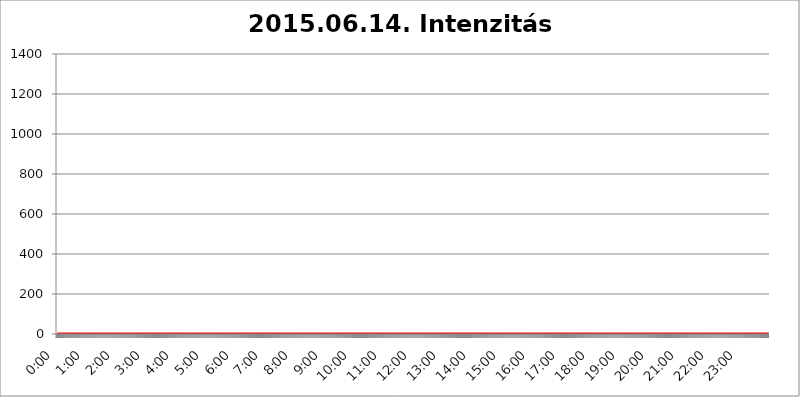
| Category | 2015.06.14. Intenzitás [W/m^2] |
|---|---|
| 0.0 | 0 |
| 0.0006944444444444445 | 0 |
| 0.001388888888888889 | 0 |
| 0.0020833333333333333 | 0 |
| 0.002777777777777778 | 0 |
| 0.003472222222222222 | 0 |
| 0.004166666666666667 | 0 |
| 0.004861111111111111 | 0 |
| 0.005555555555555556 | 0 |
| 0.0062499999999999995 | 0 |
| 0.006944444444444444 | 0 |
| 0.007638888888888889 | 0 |
| 0.008333333333333333 | 0 |
| 0.009027777777777779 | 0 |
| 0.009722222222222222 | 0 |
| 0.010416666666666666 | 0 |
| 0.011111111111111112 | 0 |
| 0.011805555555555555 | 0 |
| 0.012499999999999999 | 0 |
| 0.013194444444444444 | 0 |
| 0.013888888888888888 | 0 |
| 0.014583333333333332 | 0 |
| 0.015277777777777777 | 0 |
| 0.015972222222222224 | 0 |
| 0.016666666666666666 | 0 |
| 0.017361111111111112 | 0 |
| 0.018055555555555557 | 0 |
| 0.01875 | 0 |
| 0.019444444444444445 | 0 |
| 0.02013888888888889 | 0 |
| 0.020833333333333332 | 0 |
| 0.02152777777777778 | 0 |
| 0.022222222222222223 | 0 |
| 0.02291666666666667 | 0 |
| 0.02361111111111111 | 0 |
| 0.024305555555555556 | 0 |
| 0.024999999999999998 | 0 |
| 0.025694444444444447 | 0 |
| 0.02638888888888889 | 0 |
| 0.027083333333333334 | 0 |
| 0.027777777777777776 | 0 |
| 0.02847222222222222 | 0 |
| 0.029166666666666664 | 0 |
| 0.029861111111111113 | 0 |
| 0.030555555555555555 | 0 |
| 0.03125 | 0 |
| 0.03194444444444445 | 0 |
| 0.03263888888888889 | 0 |
| 0.03333333333333333 | 0 |
| 0.034027777777777775 | 0 |
| 0.034722222222222224 | 0 |
| 0.035416666666666666 | 0 |
| 0.036111111111111115 | 0 |
| 0.03680555555555556 | 0 |
| 0.0375 | 0 |
| 0.03819444444444444 | 0 |
| 0.03888888888888889 | 0 |
| 0.03958333333333333 | 0 |
| 0.04027777777777778 | 0 |
| 0.04097222222222222 | 0 |
| 0.041666666666666664 | 0 |
| 0.042361111111111106 | 0 |
| 0.04305555555555556 | 0 |
| 0.043750000000000004 | 0 |
| 0.044444444444444446 | 0 |
| 0.04513888888888889 | 0 |
| 0.04583333333333334 | 0 |
| 0.04652777777777778 | 0 |
| 0.04722222222222222 | 0 |
| 0.04791666666666666 | 0 |
| 0.04861111111111111 | 0 |
| 0.049305555555555554 | 0 |
| 0.049999999999999996 | 0 |
| 0.05069444444444445 | 0 |
| 0.051388888888888894 | 0 |
| 0.052083333333333336 | 0 |
| 0.05277777777777778 | 0 |
| 0.05347222222222222 | 0 |
| 0.05416666666666667 | 0 |
| 0.05486111111111111 | 0 |
| 0.05555555555555555 | 0 |
| 0.05625 | 0 |
| 0.05694444444444444 | 0 |
| 0.057638888888888885 | 0 |
| 0.05833333333333333 | 0 |
| 0.05902777777777778 | 0 |
| 0.059722222222222225 | 0 |
| 0.06041666666666667 | 0 |
| 0.061111111111111116 | 0 |
| 0.06180555555555556 | 0 |
| 0.0625 | 0 |
| 0.06319444444444444 | 0 |
| 0.06388888888888888 | 0 |
| 0.06458333333333334 | 0 |
| 0.06527777777777778 | 0 |
| 0.06597222222222222 | 0 |
| 0.06666666666666667 | 0 |
| 0.06736111111111111 | 0 |
| 0.06805555555555555 | 0 |
| 0.06874999999999999 | 0 |
| 0.06944444444444443 | 0 |
| 0.07013888888888889 | 0 |
| 0.07083333333333333 | 0 |
| 0.07152777777777779 | 0 |
| 0.07222222222222223 | 0 |
| 0.07291666666666667 | 0 |
| 0.07361111111111111 | 0 |
| 0.07430555555555556 | 0 |
| 0.075 | 0 |
| 0.07569444444444444 | 0 |
| 0.0763888888888889 | 0 |
| 0.07708333333333334 | 0 |
| 0.07777777777777778 | 0 |
| 0.07847222222222222 | 0 |
| 0.07916666666666666 | 0 |
| 0.0798611111111111 | 0 |
| 0.08055555555555556 | 0 |
| 0.08125 | 0 |
| 0.08194444444444444 | 0 |
| 0.08263888888888889 | 0 |
| 0.08333333333333333 | 0 |
| 0.08402777777777777 | 0 |
| 0.08472222222222221 | 0 |
| 0.08541666666666665 | 0 |
| 0.08611111111111112 | 0 |
| 0.08680555555555557 | 0 |
| 0.08750000000000001 | 0 |
| 0.08819444444444445 | 0 |
| 0.08888888888888889 | 0 |
| 0.08958333333333333 | 0 |
| 0.09027777777777778 | 0 |
| 0.09097222222222222 | 0 |
| 0.09166666666666667 | 0 |
| 0.09236111111111112 | 0 |
| 0.09305555555555556 | 0 |
| 0.09375 | 0 |
| 0.09444444444444444 | 0 |
| 0.09513888888888888 | 0 |
| 0.09583333333333333 | 0 |
| 0.09652777777777777 | 0 |
| 0.09722222222222222 | 0 |
| 0.09791666666666667 | 0 |
| 0.09861111111111111 | 0 |
| 0.09930555555555555 | 0 |
| 0.09999999999999999 | 0 |
| 0.10069444444444443 | 0 |
| 0.1013888888888889 | 0 |
| 0.10208333333333335 | 0 |
| 0.10277777777777779 | 0 |
| 0.10347222222222223 | 0 |
| 0.10416666666666667 | 0 |
| 0.10486111111111111 | 0 |
| 0.10555555555555556 | 0 |
| 0.10625 | 0 |
| 0.10694444444444444 | 0 |
| 0.1076388888888889 | 0 |
| 0.10833333333333334 | 0 |
| 0.10902777777777778 | 0 |
| 0.10972222222222222 | 0 |
| 0.1111111111111111 | 0 |
| 0.11180555555555556 | 0 |
| 0.11180555555555556 | 0 |
| 0.1125 | 0 |
| 0.11319444444444444 | 0 |
| 0.11388888888888889 | 0 |
| 0.11458333333333333 | 0 |
| 0.11527777777777777 | 0 |
| 0.11597222222222221 | 0 |
| 0.11666666666666665 | 0 |
| 0.1173611111111111 | 0 |
| 0.11805555555555557 | 0 |
| 0.11944444444444445 | 0 |
| 0.12013888888888889 | 0 |
| 0.12083333333333333 | 0 |
| 0.12152777777777778 | 0 |
| 0.12222222222222223 | 0 |
| 0.12291666666666667 | 0 |
| 0.12291666666666667 | 0 |
| 0.12361111111111112 | 0 |
| 0.12430555555555556 | 0 |
| 0.125 | 0 |
| 0.12569444444444444 | 0 |
| 0.12638888888888888 | 0 |
| 0.12708333333333333 | 0 |
| 0.16875 | 0 |
| 0.12847222222222224 | 0 |
| 0.12916666666666668 | 0 |
| 0.12986111111111112 | 0 |
| 0.13055555555555556 | 0 |
| 0.13125 | 0 |
| 0.13194444444444445 | 0 |
| 0.1326388888888889 | 0 |
| 0.13333333333333333 | 0 |
| 0.13402777777777777 | 0 |
| 0.13402777777777777 | 0 |
| 0.13472222222222222 | 0 |
| 0.13541666666666666 | 0 |
| 0.1361111111111111 | 0 |
| 0.13749999999999998 | 0 |
| 0.13819444444444443 | 0 |
| 0.1388888888888889 | 0 |
| 0.13958333333333334 | 0 |
| 0.14027777777777778 | 0 |
| 0.14097222222222222 | 0 |
| 0.14166666666666666 | 0 |
| 0.1423611111111111 | 0 |
| 0.14305555555555557 | 0 |
| 0.14375000000000002 | 0 |
| 0.14444444444444446 | 0 |
| 0.1451388888888889 | 0 |
| 0.1451388888888889 | 0 |
| 0.14652777777777778 | 0 |
| 0.14722222222222223 | 0 |
| 0.14791666666666667 | 0 |
| 0.1486111111111111 | 0 |
| 0.14930555555555555 | 0 |
| 0.15 | 0 |
| 0.15069444444444444 | 0 |
| 0.15138888888888888 | 0 |
| 0.15208333333333332 | 0 |
| 0.15277777777777776 | 0 |
| 0.15347222222222223 | 0 |
| 0.15416666666666667 | 0 |
| 0.15486111111111112 | 0 |
| 0.15555555555555556 | 0 |
| 0.15625 | 0 |
| 0.15694444444444444 | 0 |
| 0.15763888888888888 | 0 |
| 0.15833333333333333 | 0 |
| 0.15902777777777777 | 0 |
| 0.15972222222222224 | 0 |
| 0.16041666666666668 | 0 |
| 0.16111111111111112 | 0 |
| 0.16180555555555556 | 0 |
| 0.1625 | 0 |
| 0.16319444444444445 | 0 |
| 0.1638888888888889 | 0 |
| 0.16458333333333333 | 0 |
| 0.16527777777777777 | 0 |
| 0.16597222222222222 | 0 |
| 0.16666666666666666 | 0 |
| 0.1673611111111111 | 0 |
| 0.16805555555555554 | 0 |
| 0.16874999999999998 | 0 |
| 0.16944444444444443 | 0 |
| 0.17013888888888887 | 0 |
| 0.1708333333333333 | 0 |
| 0.17152777777777775 | 0 |
| 0.17222222222222225 | 0 |
| 0.1729166666666667 | 0 |
| 0.17361111111111113 | 0 |
| 0.17430555555555557 | 0 |
| 0.17500000000000002 | 0 |
| 0.17569444444444446 | 0 |
| 0.1763888888888889 | 0 |
| 0.17708333333333334 | 0 |
| 0.17777777777777778 | 0 |
| 0.17847222222222223 | 0 |
| 0.17916666666666667 | 0 |
| 0.1798611111111111 | 0 |
| 0.18055555555555555 | 0 |
| 0.18125 | 0 |
| 0.18194444444444444 | 0 |
| 0.1826388888888889 | 0 |
| 0.18333333333333335 | 0 |
| 0.1840277777777778 | 0 |
| 0.18472222222222223 | 0 |
| 0.18541666666666667 | 0 |
| 0.18611111111111112 | 0 |
| 0.18680555555555556 | 0 |
| 0.1875 | 0 |
| 0.18819444444444444 | 0 |
| 0.18888888888888888 | 0 |
| 0.18958333333333333 | 0 |
| 0.19027777777777777 | 0 |
| 0.1909722222222222 | 0 |
| 0.19166666666666665 | 0 |
| 0.19236111111111112 | 0 |
| 0.19305555555555554 | 0 |
| 0.19375 | 0 |
| 0.19444444444444445 | 0 |
| 0.1951388888888889 | 0 |
| 0.19583333333333333 | 0 |
| 0.19652777777777777 | 0 |
| 0.19722222222222222 | 0 |
| 0.19791666666666666 | 0 |
| 0.1986111111111111 | 0 |
| 0.19930555555555554 | 0 |
| 0.19999999999999998 | 0 |
| 0.20069444444444443 | 0 |
| 0.20138888888888887 | 0 |
| 0.2020833333333333 | 0 |
| 0.2027777777777778 | 0 |
| 0.2034722222222222 | 0 |
| 0.2041666666666667 | 0 |
| 0.20486111111111113 | 0 |
| 0.20555555555555557 | 0 |
| 0.20625000000000002 | 0 |
| 0.20694444444444446 | 0 |
| 0.2076388888888889 | 0 |
| 0.20833333333333334 | 0 |
| 0.20902777777777778 | 0 |
| 0.20972222222222223 | 0 |
| 0.21041666666666667 | 0 |
| 0.2111111111111111 | 0 |
| 0.21180555555555555 | 0 |
| 0.2125 | 0 |
| 0.21319444444444444 | 0 |
| 0.2138888888888889 | 0 |
| 0.21458333333333335 | 0 |
| 0.2152777777777778 | 0 |
| 0.21597222222222223 | 0 |
| 0.21666666666666667 | 0 |
| 0.21736111111111112 | 0 |
| 0.21805555555555556 | 0 |
| 0.21875 | 0 |
| 0.21944444444444444 | 0 |
| 0.22013888888888888 | 0 |
| 0.22083333333333333 | 0 |
| 0.22152777777777777 | 0 |
| 0.2222222222222222 | 0 |
| 0.22291666666666665 | 0 |
| 0.2236111111111111 | 0 |
| 0.22430555555555556 | 0 |
| 0.225 | 0 |
| 0.22569444444444445 | 0 |
| 0.2263888888888889 | 0 |
| 0.22708333333333333 | 0 |
| 0.22777777777777777 | 0 |
| 0.22847222222222222 | 0 |
| 0.22916666666666666 | 0 |
| 0.2298611111111111 | 0 |
| 0.23055555555555554 | 0 |
| 0.23124999999999998 | 0 |
| 0.23194444444444443 | 0 |
| 0.23263888888888887 | 0 |
| 0.2333333333333333 | 0 |
| 0.2340277777777778 | 0 |
| 0.2347222222222222 | 0 |
| 0.2354166666666667 | 0 |
| 0.23611111111111113 | 0 |
| 0.23680555555555557 | 0 |
| 0.23750000000000002 | 0 |
| 0.23819444444444446 | 0 |
| 0.2388888888888889 | 0 |
| 0.23958333333333334 | 0 |
| 0.24027777777777778 | 0 |
| 0.24097222222222223 | 0 |
| 0.24166666666666667 | 0 |
| 0.2423611111111111 | 0 |
| 0.24305555555555555 | 0 |
| 0.24375 | 0 |
| 0.24444444444444446 | 0 |
| 0.24513888888888888 | 0 |
| 0.24583333333333335 | 0 |
| 0.2465277777777778 | 0 |
| 0.24722222222222223 | 0 |
| 0.24791666666666667 | 0 |
| 0.24861111111111112 | 0 |
| 0.24930555555555556 | 0 |
| 0.25 | 0 |
| 0.25069444444444444 | 0 |
| 0.2513888888888889 | 0 |
| 0.2520833333333333 | 0 |
| 0.25277777777777777 | 0 |
| 0.2534722222222222 | 0 |
| 0.25416666666666665 | 0 |
| 0.2548611111111111 | 0 |
| 0.2555555555555556 | 0 |
| 0.25625000000000003 | 0 |
| 0.2569444444444445 | 0 |
| 0.2576388888888889 | 0 |
| 0.25833333333333336 | 0 |
| 0.2590277777777778 | 0 |
| 0.25972222222222224 | 0 |
| 0.2604166666666667 | 0 |
| 0.2611111111111111 | 0 |
| 0.26180555555555557 | 0 |
| 0.2625 | 0 |
| 0.26319444444444445 | 0 |
| 0.2638888888888889 | 0 |
| 0.26458333333333334 | 0 |
| 0.2652777777777778 | 0 |
| 0.2659722222222222 | 0 |
| 0.26666666666666666 | 0 |
| 0.2673611111111111 | 0 |
| 0.26805555555555555 | 0 |
| 0.26875 | 0 |
| 0.26944444444444443 | 0 |
| 0.2701388888888889 | 0 |
| 0.2708333333333333 | 0 |
| 0.27152777777777776 | 0 |
| 0.2722222222222222 | 0 |
| 0.27291666666666664 | 0 |
| 0.2736111111111111 | 0 |
| 0.2743055555555555 | 0 |
| 0.27499999999999997 | 0 |
| 0.27569444444444446 | 0 |
| 0.27638888888888885 | 0 |
| 0.27708333333333335 | 0 |
| 0.2777777777777778 | 0 |
| 0.27847222222222223 | 0 |
| 0.2791666666666667 | 0 |
| 0.2798611111111111 | 0 |
| 0.28055555555555556 | 0 |
| 0.28125 | 0 |
| 0.28194444444444444 | 0 |
| 0.2826388888888889 | 0 |
| 0.2833333333333333 | 0 |
| 0.28402777777777777 | 0 |
| 0.2847222222222222 | 0 |
| 0.28541666666666665 | 0 |
| 0.28611111111111115 | 0 |
| 0.28680555555555554 | 0 |
| 0.28750000000000003 | 0 |
| 0.2881944444444445 | 0 |
| 0.2888888888888889 | 0 |
| 0.28958333333333336 | 0 |
| 0.2902777777777778 | 0 |
| 0.29097222222222224 | 0 |
| 0.2916666666666667 | 0 |
| 0.2923611111111111 | 0 |
| 0.29305555555555557 | 0 |
| 0.29375 | 0 |
| 0.29444444444444445 | 0 |
| 0.2951388888888889 | 0 |
| 0.29583333333333334 | 0 |
| 0.2965277777777778 | 0 |
| 0.2972222222222222 | 0 |
| 0.29791666666666666 | 0 |
| 0.2986111111111111 | 0 |
| 0.29930555555555555 | 0 |
| 0.3 | 0 |
| 0.30069444444444443 | 0 |
| 0.3013888888888889 | 0 |
| 0.3020833333333333 | 0 |
| 0.30277777777777776 | 0 |
| 0.3034722222222222 | 0 |
| 0.30416666666666664 | 0 |
| 0.3048611111111111 | 0 |
| 0.3055555555555555 | 0 |
| 0.30624999999999997 | 0 |
| 0.3069444444444444 | 0 |
| 0.3076388888888889 | 0 |
| 0.30833333333333335 | 0 |
| 0.3090277777777778 | 0 |
| 0.30972222222222223 | 0 |
| 0.3104166666666667 | 0 |
| 0.3111111111111111 | 0 |
| 0.31180555555555556 | 0 |
| 0.3125 | 0 |
| 0.31319444444444444 | 0 |
| 0.3138888888888889 | 0 |
| 0.3145833333333333 | 0 |
| 0.31527777777777777 | 0 |
| 0.3159722222222222 | 0 |
| 0.31666666666666665 | 0 |
| 0.31736111111111115 | 0 |
| 0.31805555555555554 | 0 |
| 0.31875000000000003 | 0 |
| 0.3194444444444445 | 0 |
| 0.3201388888888889 | 0 |
| 0.32083333333333336 | 0 |
| 0.3215277777777778 | 0 |
| 0.32222222222222224 | 0 |
| 0.3229166666666667 | 0 |
| 0.3236111111111111 | 0 |
| 0.32430555555555557 | 0 |
| 0.325 | 0 |
| 0.32569444444444445 | 0 |
| 0.3263888888888889 | 0 |
| 0.32708333333333334 | 0 |
| 0.3277777777777778 | 0 |
| 0.3284722222222222 | 0 |
| 0.32916666666666666 | 0 |
| 0.3298611111111111 | 0 |
| 0.33055555555555555 | 0 |
| 0.33125 | 0 |
| 0.33194444444444443 | 0 |
| 0.3326388888888889 | 0 |
| 0.3333333333333333 | 0 |
| 0.3340277777777778 | 0 |
| 0.3347222222222222 | 0 |
| 0.3354166666666667 | 0 |
| 0.3361111111111111 | 0 |
| 0.3368055555555556 | 0 |
| 0.33749999999999997 | 0 |
| 0.33819444444444446 | 0 |
| 0.33888888888888885 | 0 |
| 0.33958333333333335 | 0 |
| 0.34027777777777773 | 0 |
| 0.34097222222222223 | 0 |
| 0.3416666666666666 | 0 |
| 0.3423611111111111 | 0 |
| 0.3430555555555555 | 0 |
| 0.34375 | 0 |
| 0.3444444444444445 | 0 |
| 0.3451388888888889 | 0 |
| 0.3458333333333334 | 0 |
| 0.34652777777777777 | 0 |
| 0.34722222222222227 | 0 |
| 0.34791666666666665 | 0 |
| 0.34861111111111115 | 0 |
| 0.34930555555555554 | 0 |
| 0.35000000000000003 | 0 |
| 0.3506944444444444 | 0 |
| 0.3513888888888889 | 0 |
| 0.3520833333333333 | 0 |
| 0.3527777777777778 | 0 |
| 0.3534722222222222 | 0 |
| 0.3541666666666667 | 0 |
| 0.3548611111111111 | 0 |
| 0.35555555555555557 | 0 |
| 0.35625 | 0 |
| 0.35694444444444445 | 0 |
| 0.3576388888888889 | 0 |
| 0.35833333333333334 | 0 |
| 0.3590277777777778 | 0 |
| 0.3597222222222222 | 0 |
| 0.36041666666666666 | 0 |
| 0.3611111111111111 | 0 |
| 0.36180555555555555 | 0 |
| 0.3625 | 0 |
| 0.36319444444444443 | 0 |
| 0.3638888888888889 | 0 |
| 0.3645833333333333 | 0 |
| 0.3652777777777778 | 0 |
| 0.3659722222222222 | 0 |
| 0.3666666666666667 | 0 |
| 0.3673611111111111 | 0 |
| 0.3680555555555556 | 0 |
| 0.36874999999999997 | 0 |
| 0.36944444444444446 | 0 |
| 0.37013888888888885 | 0 |
| 0.37083333333333335 | 0 |
| 0.37152777777777773 | 0 |
| 0.37222222222222223 | 0 |
| 0.3729166666666666 | 0 |
| 0.3736111111111111 | 0 |
| 0.3743055555555555 | 0 |
| 0.375 | 0 |
| 0.3756944444444445 | 0 |
| 0.3763888888888889 | 0 |
| 0.3770833333333334 | 0 |
| 0.37777777777777777 | 0 |
| 0.37847222222222227 | 0 |
| 0.37916666666666665 | 0 |
| 0.37986111111111115 | 0 |
| 0.38055555555555554 | 0 |
| 0.38125000000000003 | 0 |
| 0.3819444444444444 | 0 |
| 0.3826388888888889 | 0 |
| 0.3833333333333333 | 0 |
| 0.3840277777777778 | 0 |
| 0.3847222222222222 | 0 |
| 0.3854166666666667 | 0 |
| 0.3861111111111111 | 0 |
| 0.38680555555555557 | 0 |
| 0.3875 | 0 |
| 0.38819444444444445 | 0 |
| 0.3888888888888889 | 0 |
| 0.38958333333333334 | 0 |
| 0.3902777777777778 | 0 |
| 0.3909722222222222 | 0 |
| 0.39166666666666666 | 0 |
| 0.3923611111111111 | 0 |
| 0.39305555555555555 | 0 |
| 0.39375 | 0 |
| 0.39444444444444443 | 0 |
| 0.3951388888888889 | 0 |
| 0.3958333333333333 | 0 |
| 0.3965277777777778 | 0 |
| 0.3972222222222222 | 0 |
| 0.3979166666666667 | 0 |
| 0.3986111111111111 | 0 |
| 0.3993055555555556 | 0 |
| 0.39999999999999997 | 0 |
| 0.40069444444444446 | 0 |
| 0.40138888888888885 | 0 |
| 0.40208333333333335 | 0 |
| 0.40277777777777773 | 0 |
| 0.40347222222222223 | 0 |
| 0.4041666666666666 | 0 |
| 0.4048611111111111 | 0 |
| 0.4055555555555555 | 0 |
| 0.40625 | 0 |
| 0.4069444444444445 | 0 |
| 0.4076388888888889 | 0 |
| 0.4083333333333334 | 0 |
| 0.40902777777777777 | 0 |
| 0.40972222222222227 | 0 |
| 0.41041666666666665 | 0 |
| 0.41111111111111115 | 0 |
| 0.41180555555555554 | 0 |
| 0.41250000000000003 | 0 |
| 0.4131944444444444 | 0 |
| 0.4138888888888889 | 0 |
| 0.4145833333333333 | 0 |
| 0.4152777777777778 | 0 |
| 0.4159722222222222 | 0 |
| 0.4166666666666667 | 0 |
| 0.4173611111111111 | 0 |
| 0.41805555555555557 | 0 |
| 0.41875 | 0 |
| 0.41944444444444445 | 0 |
| 0.4201388888888889 | 0 |
| 0.42083333333333334 | 0 |
| 0.4215277777777778 | 0 |
| 0.4222222222222222 | 0 |
| 0.42291666666666666 | 0 |
| 0.4236111111111111 | 0 |
| 0.42430555555555555 | 0 |
| 0.425 | 0 |
| 0.42569444444444443 | 0 |
| 0.4263888888888889 | 0 |
| 0.4270833333333333 | 0 |
| 0.4277777777777778 | 0 |
| 0.4284722222222222 | 0 |
| 0.4291666666666667 | 0 |
| 0.4298611111111111 | 0 |
| 0.4305555555555556 | 0 |
| 0.43124999999999997 | 0 |
| 0.43194444444444446 | 0 |
| 0.43263888888888885 | 0 |
| 0.43333333333333335 | 0 |
| 0.43402777777777773 | 0 |
| 0.43472222222222223 | 0 |
| 0.4354166666666666 | 0 |
| 0.4361111111111111 | 0 |
| 0.4368055555555555 | 0 |
| 0.4375 | 0 |
| 0.4381944444444445 | 0 |
| 0.4388888888888889 | 0 |
| 0.4395833333333334 | 0 |
| 0.44027777777777777 | 0 |
| 0.44097222222222227 | 0 |
| 0.44166666666666665 | 0 |
| 0.44236111111111115 | 0 |
| 0.44305555555555554 | 0 |
| 0.44375000000000003 | 0 |
| 0.4444444444444444 | 0 |
| 0.4451388888888889 | 0 |
| 0.4458333333333333 | 0 |
| 0.4465277777777778 | 0 |
| 0.4472222222222222 | 0 |
| 0.4479166666666667 | 0 |
| 0.4486111111111111 | 0 |
| 0.44930555555555557 | 0 |
| 0.45 | 0 |
| 0.45069444444444445 | 0 |
| 0.4513888888888889 | 0 |
| 0.45208333333333334 | 0 |
| 0.4527777777777778 | 0 |
| 0.4534722222222222 | 0 |
| 0.45416666666666666 | 0 |
| 0.4548611111111111 | 0 |
| 0.45555555555555555 | 0 |
| 0.45625 | 0 |
| 0.45694444444444443 | 0 |
| 0.4576388888888889 | 0 |
| 0.4583333333333333 | 0 |
| 0.4590277777777778 | 0 |
| 0.4597222222222222 | 0 |
| 0.4604166666666667 | 0 |
| 0.4611111111111111 | 0 |
| 0.4618055555555556 | 0 |
| 0.46249999999999997 | 0 |
| 0.46319444444444446 | 0 |
| 0.46388888888888885 | 0 |
| 0.46458333333333335 | 0 |
| 0.46527777777777773 | 0 |
| 0.46597222222222223 | 0 |
| 0.4666666666666666 | 0 |
| 0.4673611111111111 | 0 |
| 0.4680555555555555 | 0 |
| 0.46875 | 0 |
| 0.4694444444444445 | 0 |
| 0.4701388888888889 | 0 |
| 0.4708333333333334 | 0 |
| 0.47152777777777777 | 0 |
| 0.47222222222222227 | 0 |
| 0.47291666666666665 | 0 |
| 0.47361111111111115 | 0 |
| 0.47430555555555554 | 0 |
| 0.47500000000000003 | 0 |
| 0.4756944444444444 | 0 |
| 0.4763888888888889 | 0 |
| 0.4770833333333333 | 0 |
| 0.4777777777777778 | 0 |
| 0.4784722222222222 | 0 |
| 0.4791666666666667 | 0 |
| 0.4798611111111111 | 0 |
| 0.48055555555555557 | 0 |
| 0.48125 | 0 |
| 0.48194444444444445 | 0 |
| 0.4826388888888889 | 0 |
| 0.48333333333333334 | 0 |
| 0.4840277777777778 | 0 |
| 0.4847222222222222 | 0 |
| 0.48541666666666666 | 0 |
| 0.4861111111111111 | 0 |
| 0.48680555555555555 | 0 |
| 0.4875 | 0 |
| 0.48819444444444443 | 0 |
| 0.4888888888888889 | 0 |
| 0.4895833333333333 | 0 |
| 0.4902777777777778 | 0 |
| 0.4909722222222222 | 0 |
| 0.4916666666666667 | 0 |
| 0.4923611111111111 | 0 |
| 0.4930555555555556 | 0 |
| 0.49374999999999997 | 0 |
| 0.49444444444444446 | 0 |
| 0.49513888888888885 | 0 |
| 0.49583333333333335 | 0 |
| 0.49652777777777773 | 0 |
| 0.49722222222222223 | 0 |
| 0.4979166666666666 | 0 |
| 0.4986111111111111 | 0 |
| 0.4993055555555555 | 0 |
| 0.5 | 0 |
| 0.5006944444444444 | 0 |
| 0.5013888888888889 | 0 |
| 0.5020833333333333 | 0 |
| 0.5027777777777778 | 0 |
| 0.5034722222222222 | 0 |
| 0.5041666666666667 | 0 |
| 0.5048611111111111 | 0 |
| 0.5055555555555555 | 0 |
| 0.50625 | 0 |
| 0.5069444444444444 | 0 |
| 0.5076388888888889 | 0 |
| 0.5083333333333333 | 0 |
| 0.5090277777777777 | 0 |
| 0.5097222222222222 | 0 |
| 0.5104166666666666 | 0 |
| 0.5111111111111112 | 0 |
| 0.5118055555555555 | 0 |
| 0.5125000000000001 | 0 |
| 0.5131944444444444 | 0 |
| 0.513888888888889 | 0 |
| 0.5145833333333333 | 0 |
| 0.5152777777777778 | 0 |
| 0.5159722222222222 | 0 |
| 0.5166666666666667 | 0 |
| 0.517361111111111 | 0 |
| 0.5180555555555556 | 0 |
| 0.5187499999999999 | 0 |
| 0.5194444444444445 | 0 |
| 0.5201388888888888 | 0 |
| 0.5208333333333334 | 0 |
| 0.5215277777777778 | 0 |
| 0.5222222222222223 | 0 |
| 0.5229166666666667 | 0 |
| 0.5236111111111111 | 0 |
| 0.5243055555555556 | 0 |
| 0.525 | 0 |
| 0.5256944444444445 | 0 |
| 0.5263888888888889 | 0 |
| 0.5270833333333333 | 0 |
| 0.5277777777777778 | 0 |
| 0.5284722222222222 | 0 |
| 0.5291666666666667 | 0 |
| 0.5298611111111111 | 0 |
| 0.5305555555555556 | 0 |
| 0.53125 | 0 |
| 0.5319444444444444 | 0 |
| 0.5326388888888889 | 0 |
| 0.5333333333333333 | 0 |
| 0.5340277777777778 | 0 |
| 0.5347222222222222 | 0 |
| 0.5354166666666667 | 0 |
| 0.5361111111111111 | 0 |
| 0.5368055555555555 | 0 |
| 0.5375 | 0 |
| 0.5381944444444444 | 0 |
| 0.5388888888888889 | 0 |
| 0.5395833333333333 | 0 |
| 0.5402777777777777 | 0 |
| 0.5409722222222222 | 0 |
| 0.5416666666666666 | 0 |
| 0.5423611111111112 | 0 |
| 0.5430555555555555 | 0 |
| 0.5437500000000001 | 0 |
| 0.5444444444444444 | 0 |
| 0.545138888888889 | 0 |
| 0.5458333333333333 | 0 |
| 0.5465277777777778 | 0 |
| 0.5472222222222222 | 0 |
| 0.5479166666666667 | 0 |
| 0.548611111111111 | 0 |
| 0.5493055555555556 | 0 |
| 0.5499999999999999 | 0 |
| 0.5506944444444445 | 0 |
| 0.5513888888888888 | 0 |
| 0.5520833333333334 | 0 |
| 0.5527777777777778 | 0 |
| 0.5534722222222223 | 0 |
| 0.5541666666666667 | 0 |
| 0.5548611111111111 | 0 |
| 0.5555555555555556 | 0 |
| 0.55625 | 0 |
| 0.5569444444444445 | 0 |
| 0.5576388888888889 | 0 |
| 0.5583333333333333 | 0 |
| 0.5590277777777778 | 0 |
| 0.5597222222222222 | 0 |
| 0.5604166666666667 | 0 |
| 0.5611111111111111 | 0 |
| 0.5618055555555556 | 0 |
| 0.5625 | 0 |
| 0.5631944444444444 | 0 |
| 0.5638888888888889 | 0 |
| 0.5645833333333333 | 0 |
| 0.5652777777777778 | 0 |
| 0.5659722222222222 | 0 |
| 0.5666666666666667 | 0 |
| 0.5673611111111111 | 0 |
| 0.5680555555555555 | 0 |
| 0.56875 | 0 |
| 0.5694444444444444 | 0 |
| 0.5701388888888889 | 0 |
| 0.5708333333333333 | 0 |
| 0.5715277777777777 | 0 |
| 0.5722222222222222 | 0 |
| 0.5729166666666666 | 0 |
| 0.5736111111111112 | 0 |
| 0.5743055555555555 | 0 |
| 0.5750000000000001 | 0 |
| 0.5756944444444444 | 0 |
| 0.576388888888889 | 0 |
| 0.5770833333333333 | 0 |
| 0.5777777777777778 | 0 |
| 0.5784722222222222 | 0 |
| 0.5791666666666667 | 0 |
| 0.579861111111111 | 0 |
| 0.5805555555555556 | 0 |
| 0.5812499999999999 | 0 |
| 0.5819444444444445 | 0 |
| 0.5826388888888888 | 0 |
| 0.5833333333333334 | 0 |
| 0.5840277777777778 | 0 |
| 0.5847222222222223 | 0 |
| 0.5854166666666667 | 0 |
| 0.5861111111111111 | 0 |
| 0.5868055555555556 | 0 |
| 0.5875 | 0 |
| 0.5881944444444445 | 0 |
| 0.5888888888888889 | 0 |
| 0.5895833333333333 | 0 |
| 0.5902777777777778 | 0 |
| 0.5909722222222222 | 0 |
| 0.5916666666666667 | 0 |
| 0.5923611111111111 | 0 |
| 0.5930555555555556 | 0 |
| 0.59375 | 0 |
| 0.5944444444444444 | 0 |
| 0.5951388888888889 | 0 |
| 0.5958333333333333 | 0 |
| 0.5965277777777778 | 0 |
| 0.5972222222222222 | 0 |
| 0.5979166666666667 | 0 |
| 0.5986111111111111 | 0 |
| 0.5993055555555555 | 0 |
| 0.6 | 0 |
| 0.6006944444444444 | 0 |
| 0.6013888888888889 | 0 |
| 0.6020833333333333 | 0 |
| 0.6027777777777777 | 0 |
| 0.6034722222222222 | 0 |
| 0.6041666666666666 | 0 |
| 0.6048611111111112 | 0 |
| 0.6055555555555555 | 0 |
| 0.6062500000000001 | 0 |
| 0.6069444444444444 | 0 |
| 0.607638888888889 | 0 |
| 0.6083333333333333 | 0 |
| 0.6090277777777778 | 0 |
| 0.6097222222222222 | 0 |
| 0.6104166666666667 | 0 |
| 0.611111111111111 | 0 |
| 0.6118055555555556 | 0 |
| 0.6124999999999999 | 0 |
| 0.6131944444444445 | 0 |
| 0.6138888888888888 | 0 |
| 0.6145833333333334 | 0 |
| 0.6152777777777778 | 0 |
| 0.6159722222222223 | 0 |
| 0.6166666666666667 | 0 |
| 0.6173611111111111 | 0 |
| 0.6180555555555556 | 0 |
| 0.61875 | 0 |
| 0.6194444444444445 | 0 |
| 0.6201388888888889 | 0 |
| 0.6208333333333333 | 0 |
| 0.6215277777777778 | 0 |
| 0.6222222222222222 | 0 |
| 0.6229166666666667 | 0 |
| 0.6236111111111111 | 0 |
| 0.6243055555555556 | 0 |
| 0.625 | 0 |
| 0.6256944444444444 | 0 |
| 0.6263888888888889 | 0 |
| 0.6270833333333333 | 0 |
| 0.6277777777777778 | 0 |
| 0.6284722222222222 | 0 |
| 0.6291666666666667 | 0 |
| 0.6298611111111111 | 0 |
| 0.6305555555555555 | 0 |
| 0.63125 | 0 |
| 0.6319444444444444 | 0 |
| 0.6326388888888889 | 0 |
| 0.6333333333333333 | 0 |
| 0.6340277777777777 | 0 |
| 0.6347222222222222 | 0 |
| 0.6354166666666666 | 0 |
| 0.6361111111111112 | 0 |
| 0.6368055555555555 | 0 |
| 0.6375000000000001 | 0 |
| 0.6381944444444444 | 0 |
| 0.638888888888889 | 0 |
| 0.6395833333333333 | 0 |
| 0.6402777777777778 | 0 |
| 0.6409722222222222 | 0 |
| 0.6416666666666667 | 0 |
| 0.642361111111111 | 0 |
| 0.6430555555555556 | 0 |
| 0.6437499999999999 | 0 |
| 0.6444444444444445 | 0 |
| 0.6451388888888888 | 0 |
| 0.6458333333333334 | 0 |
| 0.6465277777777778 | 0 |
| 0.6472222222222223 | 0 |
| 0.6479166666666667 | 0 |
| 0.6486111111111111 | 0 |
| 0.6493055555555556 | 0 |
| 0.65 | 0 |
| 0.6506944444444445 | 0 |
| 0.6513888888888889 | 0 |
| 0.6520833333333333 | 0 |
| 0.6527777777777778 | 0 |
| 0.6534722222222222 | 0 |
| 0.6541666666666667 | 0 |
| 0.6548611111111111 | 0 |
| 0.6555555555555556 | 0 |
| 0.65625 | 0 |
| 0.6569444444444444 | 0 |
| 0.6576388888888889 | 0 |
| 0.6583333333333333 | 0 |
| 0.6590277777777778 | 0 |
| 0.6597222222222222 | 0 |
| 0.6604166666666667 | 0 |
| 0.6611111111111111 | 0 |
| 0.6618055555555555 | 0 |
| 0.6625 | 0 |
| 0.6631944444444444 | 0 |
| 0.6638888888888889 | 0 |
| 0.6645833333333333 | 0 |
| 0.6652777777777777 | 0 |
| 0.6659722222222222 | 0 |
| 0.6666666666666666 | 0 |
| 0.6673611111111111 | 0 |
| 0.6680555555555556 | 0 |
| 0.6687500000000001 | 0 |
| 0.6694444444444444 | 0 |
| 0.6701388888888888 | 0 |
| 0.6708333333333334 | 0 |
| 0.6715277777777778 | 0 |
| 0.6722222222222222 | 0 |
| 0.6729166666666666 | 0 |
| 0.6736111111111112 | 0 |
| 0.6743055555555556 | 0 |
| 0.6749999999999999 | 0 |
| 0.6756944444444444 | 0 |
| 0.6763888888888889 | 0 |
| 0.6770833333333334 | 0 |
| 0.6777777777777777 | 0 |
| 0.6784722222222223 | 0 |
| 0.6791666666666667 | 0 |
| 0.6798611111111111 | 0 |
| 0.6805555555555555 | 0 |
| 0.68125 | 0 |
| 0.6819444444444445 | 0 |
| 0.6826388888888889 | 0 |
| 0.6833333333333332 | 0 |
| 0.6840277777777778 | 0 |
| 0.6847222222222222 | 0 |
| 0.6854166666666667 | 0 |
| 0.686111111111111 | 0 |
| 0.6868055555555556 | 0 |
| 0.6875 | 0 |
| 0.6881944444444444 | 0 |
| 0.688888888888889 | 0 |
| 0.6895833333333333 | 0 |
| 0.6902777777777778 | 0 |
| 0.6909722222222222 | 0 |
| 0.6916666666666668 | 0 |
| 0.6923611111111111 | 0 |
| 0.6930555555555555 | 0 |
| 0.69375 | 0 |
| 0.6944444444444445 | 0 |
| 0.6951388888888889 | 0 |
| 0.6958333333333333 | 0 |
| 0.6965277777777777 | 0 |
| 0.6972222222222223 | 0 |
| 0.6979166666666666 | 0 |
| 0.6986111111111111 | 0 |
| 0.6993055555555556 | 0 |
| 0.7000000000000001 | 0 |
| 0.7006944444444444 | 0 |
| 0.7013888888888888 | 0 |
| 0.7020833333333334 | 0 |
| 0.7027777777777778 | 0 |
| 0.7034722222222222 | 0 |
| 0.7041666666666666 | 0 |
| 0.7048611111111112 | 0 |
| 0.7055555555555556 | 0 |
| 0.7062499999999999 | 0 |
| 0.7069444444444444 | 0 |
| 0.7076388888888889 | 0 |
| 0.7083333333333334 | 0 |
| 0.7090277777777777 | 0 |
| 0.7097222222222223 | 0 |
| 0.7104166666666667 | 0 |
| 0.7111111111111111 | 0 |
| 0.7118055555555555 | 0 |
| 0.7125 | 0 |
| 0.7131944444444445 | 0 |
| 0.7138888888888889 | 0 |
| 0.7145833333333332 | 0 |
| 0.7152777777777778 | 0 |
| 0.7159722222222222 | 0 |
| 0.7166666666666667 | 0 |
| 0.717361111111111 | 0 |
| 0.7180555555555556 | 0 |
| 0.71875 | 0 |
| 0.7194444444444444 | 0 |
| 0.720138888888889 | 0 |
| 0.7208333333333333 | 0 |
| 0.7215277777777778 | 0 |
| 0.7222222222222222 | 0 |
| 0.7229166666666668 | 0 |
| 0.7236111111111111 | 0 |
| 0.7243055555555555 | 0 |
| 0.725 | 0 |
| 0.7256944444444445 | 0 |
| 0.7263888888888889 | 0 |
| 0.7270833333333333 | 0 |
| 0.7277777777777777 | 0 |
| 0.7284722222222223 | 0 |
| 0.7291666666666666 | 0 |
| 0.7298611111111111 | 0 |
| 0.7305555555555556 | 0 |
| 0.7312500000000001 | 0 |
| 0.7319444444444444 | 0 |
| 0.7326388888888888 | 0 |
| 0.7333333333333334 | 0 |
| 0.7340277777777778 | 0 |
| 0.7347222222222222 | 0 |
| 0.7354166666666666 | 0 |
| 0.7361111111111112 | 0 |
| 0.7368055555555556 | 0 |
| 0.7374999999999999 | 0 |
| 0.7381944444444444 | 0 |
| 0.7388888888888889 | 0 |
| 0.7395833333333334 | 0 |
| 0.7402777777777777 | 0 |
| 0.7409722222222223 | 0 |
| 0.7416666666666667 | 0 |
| 0.7423611111111111 | 0 |
| 0.7430555555555555 | 0 |
| 0.74375 | 0 |
| 0.7444444444444445 | 0 |
| 0.7451388888888889 | 0 |
| 0.7458333333333332 | 0 |
| 0.7465277777777778 | 0 |
| 0.7472222222222222 | 0 |
| 0.7479166666666667 | 0 |
| 0.748611111111111 | 0 |
| 0.7493055555555556 | 0 |
| 0.75 | 0 |
| 0.7506944444444444 | 0 |
| 0.751388888888889 | 0 |
| 0.7520833333333333 | 0 |
| 0.7527777777777778 | 0 |
| 0.7534722222222222 | 0 |
| 0.7541666666666668 | 0 |
| 0.7548611111111111 | 0 |
| 0.7555555555555555 | 0 |
| 0.75625 | 0 |
| 0.7569444444444445 | 0 |
| 0.7576388888888889 | 0 |
| 0.7583333333333333 | 0 |
| 0.7590277777777777 | 0 |
| 0.7597222222222223 | 0 |
| 0.7604166666666666 | 0 |
| 0.7611111111111111 | 0 |
| 0.7618055555555556 | 0 |
| 0.7625000000000001 | 0 |
| 0.7631944444444444 | 0 |
| 0.7638888888888888 | 0 |
| 0.7645833333333334 | 0 |
| 0.7652777777777778 | 0 |
| 0.7659722222222222 | 0 |
| 0.7666666666666666 | 0 |
| 0.7673611111111112 | 0 |
| 0.7680555555555556 | 0 |
| 0.7687499999999999 | 0 |
| 0.7694444444444444 | 0 |
| 0.7701388888888889 | 0 |
| 0.7708333333333334 | 0 |
| 0.7715277777777777 | 0 |
| 0.7722222222222223 | 0 |
| 0.7729166666666667 | 0 |
| 0.7736111111111111 | 0 |
| 0.7743055555555555 | 0 |
| 0.775 | 0 |
| 0.7756944444444445 | 0 |
| 0.7763888888888889 | 0 |
| 0.7770833333333332 | 0 |
| 0.7777777777777778 | 0 |
| 0.7784722222222222 | 0 |
| 0.7791666666666667 | 0 |
| 0.779861111111111 | 0 |
| 0.7805555555555556 | 0 |
| 0.78125 | 0 |
| 0.7819444444444444 | 0 |
| 0.782638888888889 | 0 |
| 0.7833333333333333 | 0 |
| 0.7840277777777778 | 0 |
| 0.7847222222222222 | 0 |
| 0.7854166666666668 | 0 |
| 0.7861111111111111 | 0 |
| 0.7868055555555555 | 0 |
| 0.7875 | 0 |
| 0.7881944444444445 | 0 |
| 0.7888888888888889 | 0 |
| 0.7895833333333333 | 0 |
| 0.7902777777777777 | 0 |
| 0.7909722222222223 | 0 |
| 0.7916666666666666 | 0 |
| 0.7923611111111111 | 0 |
| 0.7930555555555556 | 0 |
| 0.7937500000000001 | 0 |
| 0.7944444444444444 | 0 |
| 0.7951388888888888 | 0 |
| 0.7958333333333334 | 0 |
| 0.7965277777777778 | 0 |
| 0.7972222222222222 | 0 |
| 0.7979166666666666 | 0 |
| 0.7986111111111112 | 0 |
| 0.7993055555555556 | 0 |
| 0.7999999999999999 | 0 |
| 0.8006944444444444 | 0 |
| 0.8013888888888889 | 0 |
| 0.8020833333333334 | 0 |
| 0.8027777777777777 | 0 |
| 0.8034722222222223 | 0 |
| 0.8041666666666667 | 0 |
| 0.8048611111111111 | 0 |
| 0.8055555555555555 | 0 |
| 0.80625 | 0 |
| 0.8069444444444445 | 0 |
| 0.8076388888888889 | 0 |
| 0.8083333333333332 | 0 |
| 0.8090277777777778 | 0 |
| 0.8097222222222222 | 0 |
| 0.8104166666666667 | 0 |
| 0.811111111111111 | 0 |
| 0.8118055555555556 | 0 |
| 0.8125 | 0 |
| 0.8131944444444444 | 0 |
| 0.813888888888889 | 0 |
| 0.8145833333333333 | 0 |
| 0.8152777777777778 | 0 |
| 0.8159722222222222 | 0 |
| 0.8166666666666668 | 0 |
| 0.8173611111111111 | 0 |
| 0.8180555555555555 | 0 |
| 0.81875 | 0 |
| 0.8194444444444445 | 0 |
| 0.8201388888888889 | 0 |
| 0.8208333333333333 | 0 |
| 0.8215277777777777 | 0 |
| 0.8222222222222223 | 0 |
| 0.8229166666666666 | 0 |
| 0.8236111111111111 | 0 |
| 0.8243055555555556 | 0 |
| 0.8250000000000001 | 0 |
| 0.8256944444444444 | 0 |
| 0.8263888888888888 | 0 |
| 0.8270833333333334 | 0 |
| 0.8277777777777778 | 0 |
| 0.8284722222222222 | 0 |
| 0.8291666666666666 | 0 |
| 0.8298611111111112 | 0 |
| 0.8305555555555556 | 0 |
| 0.8312499999999999 | 0 |
| 0.8319444444444444 | 0 |
| 0.8326388888888889 | 0 |
| 0.8333333333333334 | 0 |
| 0.8340277777777777 | 0 |
| 0.8347222222222223 | 0 |
| 0.8354166666666667 | 0 |
| 0.8361111111111111 | 0 |
| 0.8368055555555555 | 0 |
| 0.8375 | 0 |
| 0.8381944444444445 | 0 |
| 0.8388888888888889 | 0 |
| 0.8395833333333332 | 0 |
| 0.8402777777777778 | 0 |
| 0.8409722222222222 | 0 |
| 0.8416666666666667 | 0 |
| 0.842361111111111 | 0 |
| 0.8430555555555556 | 0 |
| 0.84375 | 0 |
| 0.8444444444444444 | 0 |
| 0.845138888888889 | 0 |
| 0.8458333333333333 | 0 |
| 0.8465277777777778 | 0 |
| 0.8472222222222222 | 0 |
| 0.8479166666666668 | 0 |
| 0.8486111111111111 | 0 |
| 0.8493055555555555 | 0 |
| 0.85 | 0 |
| 0.8506944444444445 | 0 |
| 0.8513888888888889 | 0 |
| 0.8520833333333333 | 0 |
| 0.8527777777777777 | 0 |
| 0.8534722222222223 | 0 |
| 0.8541666666666666 | 0 |
| 0.8548611111111111 | 0 |
| 0.8555555555555556 | 0 |
| 0.8562500000000001 | 0 |
| 0.8569444444444444 | 0 |
| 0.8576388888888888 | 0 |
| 0.8583333333333334 | 0 |
| 0.8590277777777778 | 0 |
| 0.8597222222222222 | 0 |
| 0.8604166666666666 | 0 |
| 0.8611111111111112 | 0 |
| 0.8618055555555556 | 0 |
| 0.8624999999999999 | 0 |
| 0.8631944444444444 | 0 |
| 0.8638888888888889 | 0 |
| 0.8645833333333334 | 0 |
| 0.8652777777777777 | 0 |
| 0.8659722222222223 | 0 |
| 0.8666666666666667 | 0 |
| 0.8673611111111111 | 0 |
| 0.8680555555555555 | 0 |
| 0.86875 | 0 |
| 0.8694444444444445 | 0 |
| 0.8701388888888889 | 0 |
| 0.8708333333333332 | 0 |
| 0.8715277777777778 | 0 |
| 0.8722222222222222 | 0 |
| 0.8729166666666667 | 0 |
| 0.873611111111111 | 0 |
| 0.8743055555555556 | 0 |
| 0.875 | 0 |
| 0.8756944444444444 | 0 |
| 0.876388888888889 | 0 |
| 0.8770833333333333 | 0 |
| 0.8777777777777778 | 0 |
| 0.8784722222222222 | 0 |
| 0.8791666666666668 | 0 |
| 0.8798611111111111 | 0 |
| 0.8805555555555555 | 0 |
| 0.88125 | 0 |
| 0.8819444444444445 | 0 |
| 0.8826388888888889 | 0 |
| 0.8833333333333333 | 0 |
| 0.8840277777777777 | 0 |
| 0.8847222222222223 | 0 |
| 0.8854166666666666 | 0 |
| 0.8861111111111111 | 0 |
| 0.8868055555555556 | 0 |
| 0.8875000000000001 | 0 |
| 0.8881944444444444 | 0 |
| 0.8888888888888888 | 0 |
| 0.8895833333333334 | 0 |
| 0.8902777777777778 | 0 |
| 0.8909722222222222 | 0 |
| 0.8916666666666666 | 0 |
| 0.8923611111111112 | 0 |
| 0.8930555555555556 | 0 |
| 0.8937499999999999 | 0 |
| 0.8944444444444444 | 0 |
| 0.8951388888888889 | 0 |
| 0.8958333333333334 | 0 |
| 0.8965277777777777 | 0 |
| 0.8972222222222223 | 0 |
| 0.8979166666666667 | 0 |
| 0.8986111111111111 | 0 |
| 0.8993055555555555 | 0 |
| 0.9 | 0 |
| 0.9006944444444445 | 0 |
| 0.9013888888888889 | 0 |
| 0.9020833333333332 | 0 |
| 0.9027777777777778 | 0 |
| 0.9034722222222222 | 0 |
| 0.9041666666666667 | 0 |
| 0.904861111111111 | 0 |
| 0.9055555555555556 | 0 |
| 0.90625 | 0 |
| 0.9069444444444444 | 0 |
| 0.907638888888889 | 0 |
| 0.9083333333333333 | 0 |
| 0.9090277777777778 | 0 |
| 0.9097222222222222 | 0 |
| 0.9104166666666668 | 0 |
| 0.9111111111111111 | 0 |
| 0.9118055555555555 | 0 |
| 0.9125 | 0 |
| 0.9131944444444445 | 0 |
| 0.9138888888888889 | 0 |
| 0.9145833333333333 | 0 |
| 0.9152777777777777 | 0 |
| 0.9159722222222223 | 0 |
| 0.9166666666666666 | 0 |
| 0.9173611111111111 | 0 |
| 0.9180555555555556 | 0 |
| 0.9187500000000001 | 0 |
| 0.9194444444444444 | 0 |
| 0.9201388888888888 | 0 |
| 0.9208333333333334 | 0 |
| 0.9215277777777778 | 0 |
| 0.9222222222222222 | 0 |
| 0.9229166666666666 | 0 |
| 0.9236111111111112 | 0 |
| 0.9243055555555556 | 0 |
| 0.9249999999999999 | 0 |
| 0.9256944444444444 | 0 |
| 0.9263888888888889 | 0 |
| 0.9270833333333334 | 0 |
| 0.9277777777777777 | 0 |
| 0.9284722222222223 | 0 |
| 0.9291666666666667 | 0 |
| 0.9298611111111111 | 0 |
| 0.9305555555555555 | 0 |
| 0.93125 | 0 |
| 0.9319444444444445 | 0 |
| 0.9326388888888889 | 0 |
| 0.9333333333333332 | 0 |
| 0.9340277777777778 | 0 |
| 0.9347222222222222 | 0 |
| 0.9354166666666667 | 0 |
| 0.936111111111111 | 0 |
| 0.9368055555555556 | 0 |
| 0.9375 | 0 |
| 0.9381944444444444 | 0 |
| 0.938888888888889 | 0 |
| 0.9395833333333333 | 0 |
| 0.9402777777777778 | 0 |
| 0.9409722222222222 | 0 |
| 0.9416666666666668 | 0 |
| 0.9423611111111111 | 0 |
| 0.9430555555555555 | 0 |
| 0.94375 | 0 |
| 0.9444444444444445 | 0 |
| 0.9451388888888889 | 0 |
| 0.9458333333333333 | 0 |
| 0.9465277777777777 | 0 |
| 0.9472222222222223 | 0 |
| 0.9479166666666666 | 0 |
| 0.9486111111111111 | 0 |
| 0.9493055555555556 | 0 |
| 0.9500000000000001 | 0 |
| 0.9506944444444444 | 0 |
| 0.9513888888888888 | 0 |
| 0.9520833333333334 | 0 |
| 0.9527777777777778 | 0 |
| 0.9534722222222222 | 0 |
| 0.9541666666666666 | 0 |
| 0.9548611111111112 | 0 |
| 0.9555555555555556 | 0 |
| 0.9562499999999999 | 0 |
| 0.9569444444444444 | 0 |
| 0.9576388888888889 | 0 |
| 0.9583333333333334 | 0 |
| 0.9590277777777777 | 0 |
| 0.9597222222222223 | 0 |
| 0.9604166666666667 | 0 |
| 0.9611111111111111 | 0 |
| 0.9618055555555555 | 0 |
| 0.9625 | 0 |
| 0.9631944444444445 | 0 |
| 0.9638888888888889 | 0 |
| 0.9645833333333332 | 0 |
| 0.9652777777777778 | 0 |
| 0.9659722222222222 | 0 |
| 0.9666666666666667 | 0 |
| 0.967361111111111 | 0 |
| 0.9680555555555556 | 0 |
| 0.96875 | 0 |
| 0.9694444444444444 | 0 |
| 0.970138888888889 | 0 |
| 0.9708333333333333 | 0 |
| 0.9715277777777778 | 0 |
| 0.9722222222222222 | 0 |
| 0.9729166666666668 | 0 |
| 0.9736111111111111 | 0 |
| 0.9743055555555555 | 0 |
| 0.975 | 0 |
| 0.9756944444444445 | 0 |
| 0.9763888888888889 | 0 |
| 0.9770833333333333 | 0 |
| 0.9777777777777777 | 0 |
| 0.9784722222222223 | 0 |
| 0.9791666666666666 | 0 |
| 0.9798611111111111 | 0 |
| 0.9805555555555556 | 0 |
| 0.9812500000000001 | 0 |
| 0.9819444444444444 | 0 |
| 0.9826388888888888 | 0 |
| 0.9833333333333334 | 0 |
| 0.9840277777777778 | 0 |
| 0.9847222222222222 | 0 |
| 0.9854166666666666 | 0 |
| 0.9861111111111112 | 0 |
| 0.9868055555555556 | 0 |
| 0.9874999999999999 | 0 |
| 0.9881944444444444 | 0 |
| 0.9888888888888889 | 0 |
| 0.9895833333333334 | 0 |
| 0.9902777777777777 | 0 |
| 0.9909722222222223 | 0 |
| 0.9916666666666667 | 0 |
| 0.9923611111111111 | 0 |
| 0.9930555555555555 | 0 |
| 0.99375 | 0 |
| 0.9944444444444445 | 0 |
| 0.9951388888888889 | 0 |
| 0.9958333333333332 | 0 |
| 0.9965277777777778 | 0 |
| 0.9972222222222222 | 0 |
| 0.9979166666666667 | 0 |
| 0.998611111111111 | 0 |
| 0.9993055555555556 | 0 |